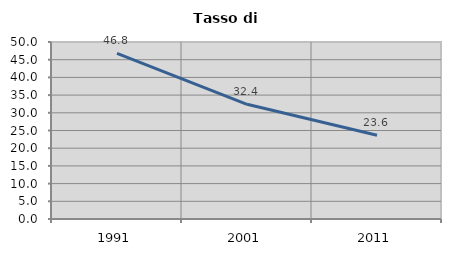
| Category | Tasso di disoccupazione   |
|---|---|
| 1991.0 | 46.809 |
| 2001.0 | 32.402 |
| 2011.0 | 23.649 |